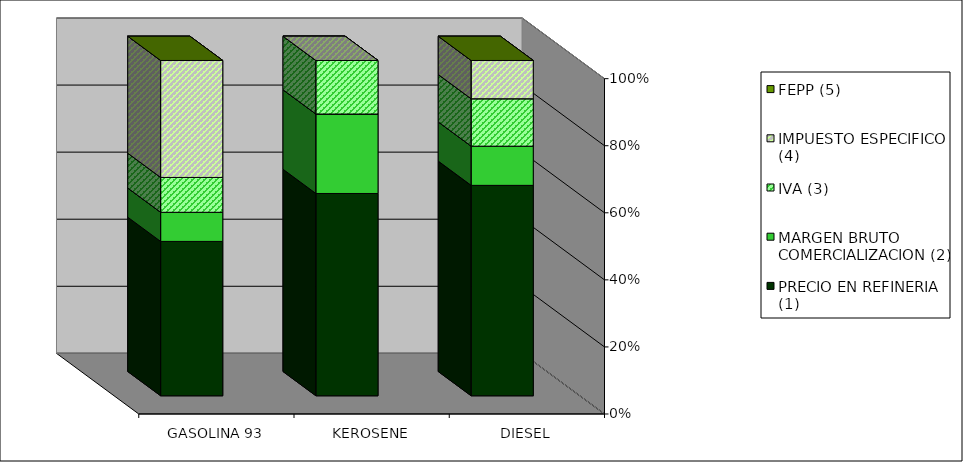
| Category | PRECIO EN REFINERIA (1) | MARGEN BRUTO COMERCIALIZACION (2) | IVA (3) | IMPUESTO ESPECIFICO (4) | FEPP (5) |
|---|---|---|---|---|---|
| GASOLINA 93 | 0.46 | 0.087 | 0.104 | 0.349 | 0 |
| KEROSENE | 0.603 | 0.237 | 0.16 | 0 | 0 |
| DIESEL | 0.628 | 0.117 | 0.141 | 0.114 | 0 |